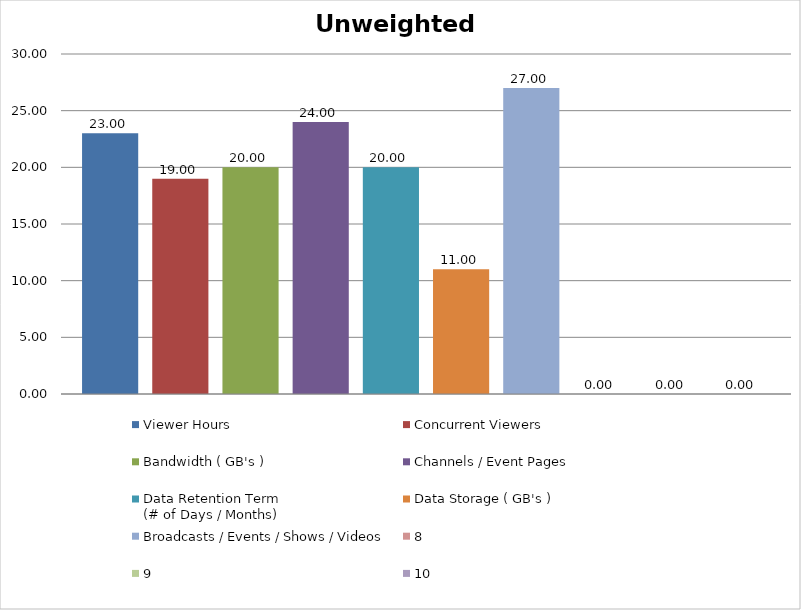
| Category | Viewer Hours | Concurrent Viewers | Bandwidth ( GB's ) | Channels / Event Pages | Data Retention Term
(# of Days / Months) | Data Storage ( GB's ) | Broadcasts / Events / Shows / Videos | Series 7 | Series 8 | Series 9 |
|---|---|---|---|---|---|---|---|---|---|---|
| 0 | 23 | 19 | 20 | 24 | 20 | 11 | 27 | 0 | 0 | 0 |